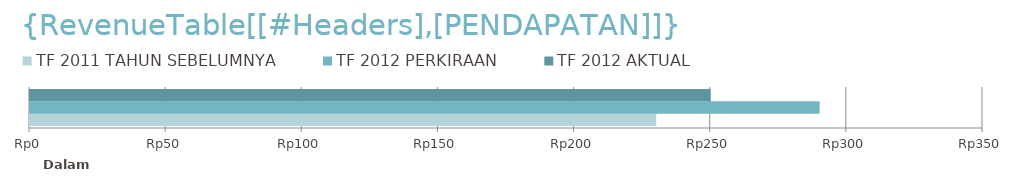
| Category | TF 2011 | TF 2012 |
|---|---|---|
| 0 | 230000 | 250000 |